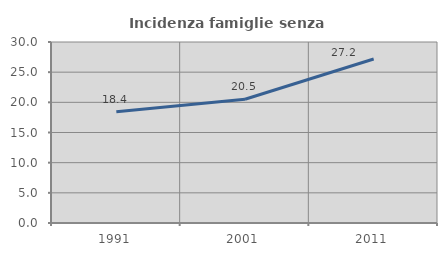
| Category | Incidenza famiglie senza nuclei |
|---|---|
| 1991.0 | 18.447 |
| 2001.0 | 20.509 |
| 2011.0 | 27.181 |